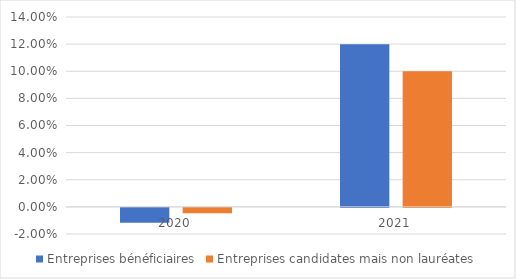
| Category | Entreprises bénéficiaires | Entreprises candidates mais non lauréates |
|---|---|---|
| 2020.0 | -0.011 | -0.004 |
| 2021.0 | 0.12 | 0.1 |